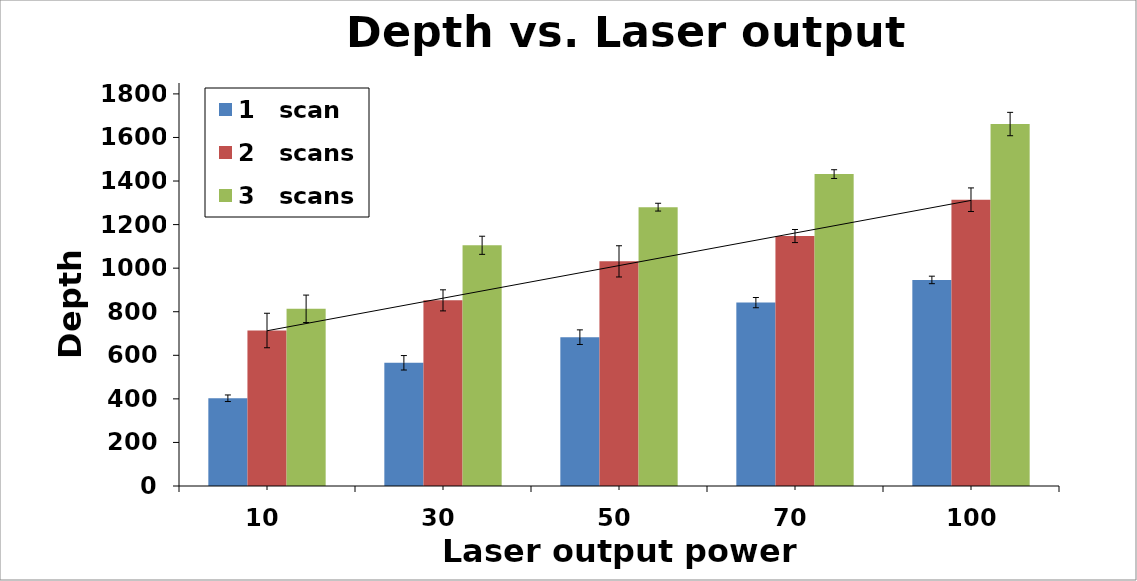
| Category | 1   scan | 2   scans | 3   scans |
|---|---|---|---|
| 10.0 | 402.8 | 713.8 | 813.4 |
| 30.0 | 565.6 | 852.2 | 1105 |
| 50.0 | 683.2 | 1031.2 | 1280 |
| 70.0 | 841.8 | 1147.4 | 1431.8 |
| 100.0 | 946 | 1314.2 | 1661.6 |